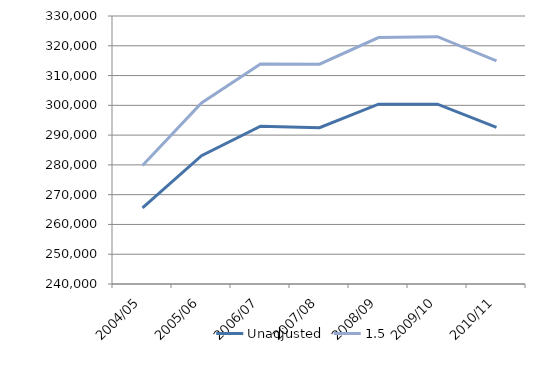
| Category | Unadjusted | 1.5 |
|---|---|---|
| 2004/05 | 265600 | 279802.684 |
| 2005/06 | 283100 | 300821.069 |
| 2006/07 | 293000 | 313861.298 |
| 2007/08 | 292500 | 313818.465 |
| 2008/09 | 300400 | 322758.219 |
| 2009/10 | 300400 | 323046.591 |
| 2010/11 | 292567 | 314950.671 |